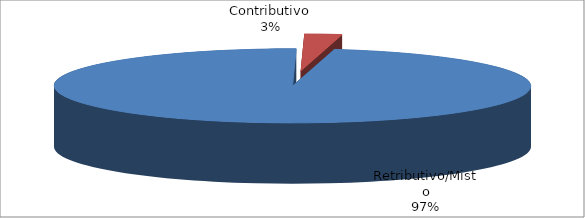
| Category | Decorrenti ANNO 2019 |
|---|---|
| Retributivo/Misto | 36978 |
| Contributivo | 961 |